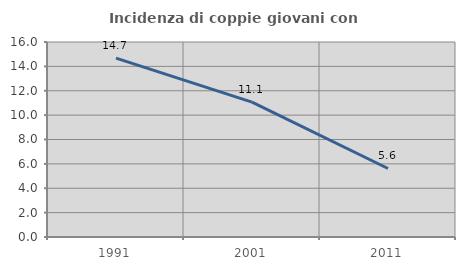
| Category | Incidenza di coppie giovani con figli |
|---|---|
| 1991.0 | 14.673 |
| 2001.0 | 11.067 |
| 2011.0 | 5.622 |